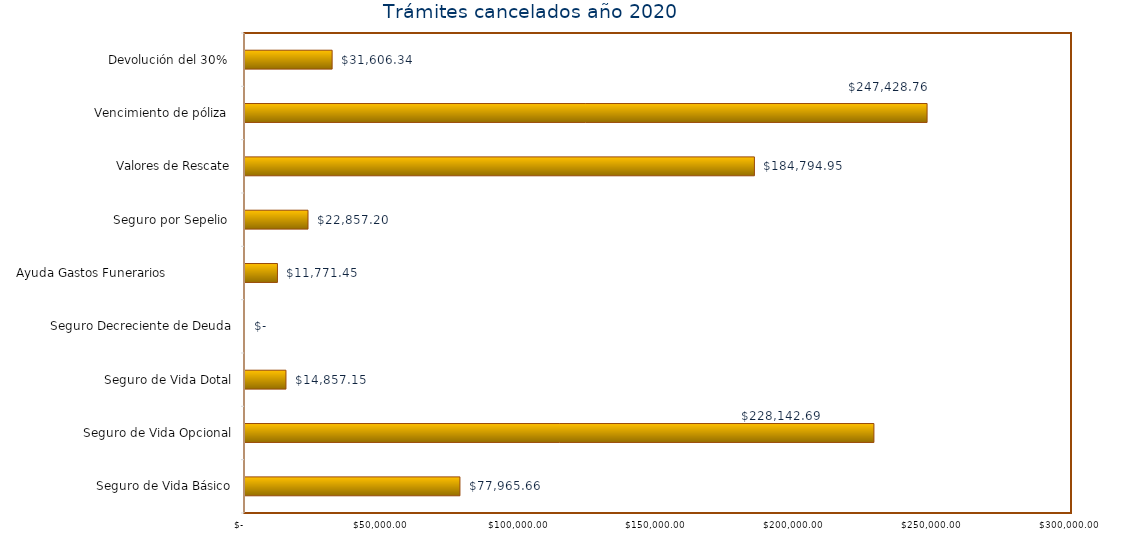
| Category | Monto  |
|---|---|
| Seguro de Vida Básico | 77965.66 |
| Seguro de Vida Opcional | 228142.69 |
| Seguro de Vida Dotal | 14857.15 |
| Seguro Decreciente de Deuda | 0 |
| Ayuda Gastos Funerarios                  | 11771.45 |
| Seguro por Sepelio  | 22857.2 |
| Valores de Rescate | 184794.95 |
| Vencimiento de póliza  | 247428.76 |
| Devolución del 30%  | 31606.34 |